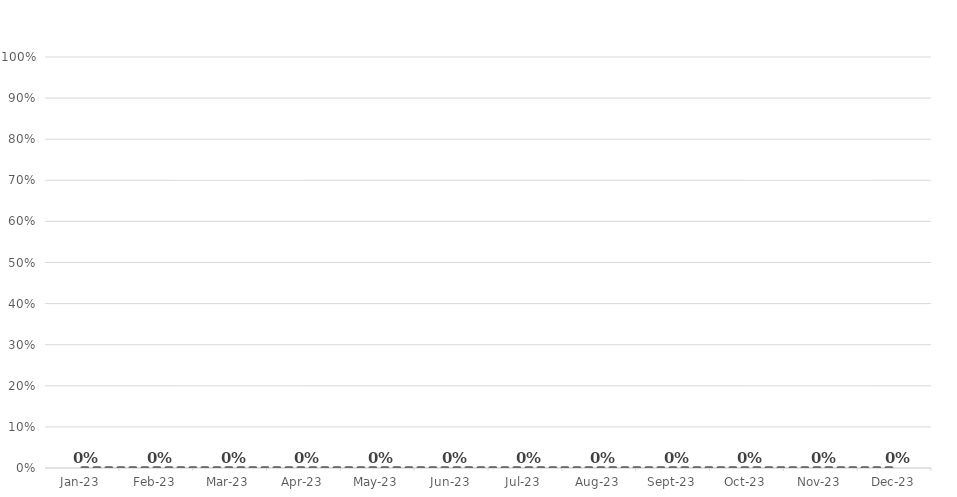
| Category | Wealth-building rate |
|---|---|
| 2023-01-01 | 0 |
| 2023-02-01 | 0 |
| 2023-03-01 | 0 |
| 2023-04-01 | 0 |
| 2023-05-01 | 0 |
| 2023-06-01 | 0 |
| 2023-07-01 | 0 |
| 2023-08-01 | 0 |
| 2023-09-01 | 0 |
| 2023-10-01 | 0 |
| 2023-11-01 | 0 |
| 2023-12-01 | 0 |